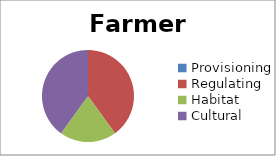
| Category | Farmers | Citizens | Total |
|---|---|---|---|
| Provisioning | 0 | 0 | 0 |
| Regulating | 4 | 2 | 6 |
| Habitat | 2 | 3 | 5 |
| Cultural | 4 | 9 | 13 |